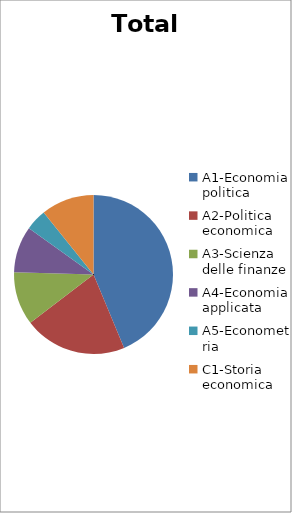
| Category | Totale | Series 1 |
|---|---|---|
| A1-Economia politica | 730 |  |
| A2-Politica economica | 349 |  |
| A3-Scienza delle finanze | 181 |  |
| A4-Economia applicata | 158 |  |
| A5-Econometria | 72 |  |
| C1-Storia economica | 180 |  |